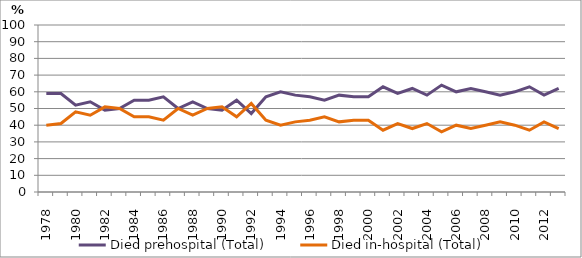
| Category | Died prehospital (Total) | Died in-hospital (Total) |
|---|---|---|
| 1978.0 | 59 | 40 |
| 1979.0 | 59 | 41 |
| 1980.0 | 52 | 48 |
| 1981.0 | 54 | 46 |
| 1982.0 | 49 | 51 |
| 1983.0 | 50 | 50 |
| 1984.0 | 55 | 45 |
| 1985.0 | 55 | 45 |
| 1986.0 | 57 | 43 |
| 1987.0 | 50 | 50 |
| 1988.0 | 54 | 46 |
| 1989.0 | 50 | 50 |
| 1990.0 | 49 | 51 |
| 1991.0 | 55 | 45 |
| 1992.0 | 47 | 53 |
| 1993.0 | 57 | 43 |
| 1994.0 | 60 | 40 |
| 1995.0 | 58 | 42 |
| 1996.0 | 57 | 43 |
| 1997.0 | 55 | 45 |
| 1998.0 | 58 | 42 |
| 1999.0 | 57 | 43 |
| 2000.0 | 57 | 43 |
| 2001.0 | 63 | 37 |
| 2002.0 | 59 | 41 |
| 2003.0 | 62 | 38 |
| 2004.0 | 58 | 41 |
| 2005.0 | 64 | 36 |
| 2006.0 | 60 | 40 |
| 2007.0 | 62 | 38 |
| 2008.0 | 60 | 40 |
| 2009.0 | 58 | 42 |
| 2010.0 | 60 | 40 |
| 2011.0 | 63 | 37 |
| 2012.0 | 58 | 42 |
| 2013.0 | 62 | 38 |